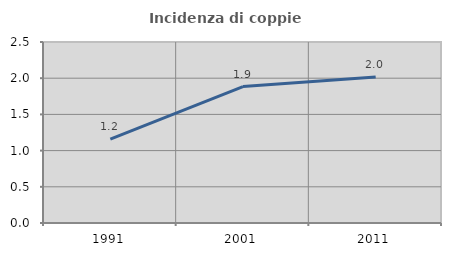
| Category | Incidenza di coppie miste |
|---|---|
| 1991.0 | 1.158 |
| 2001.0 | 1.885 |
| 2011.0 | 2.016 |